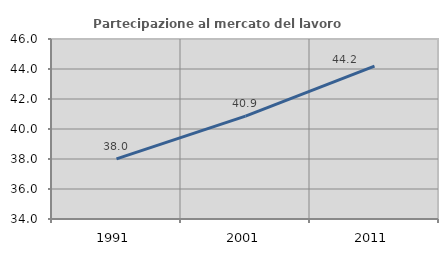
| Category | Partecipazione al mercato del lavoro  femminile |
|---|---|
| 1991.0 | 38.009 |
| 2001.0 | 40.861 |
| 2011.0 | 44.189 |